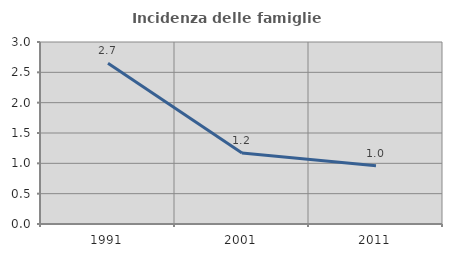
| Category | Incidenza delle famiglie numerose |
|---|---|
| 1991.0 | 2.652 |
| 2001.0 | 1.172 |
| 2011.0 | 0.962 |